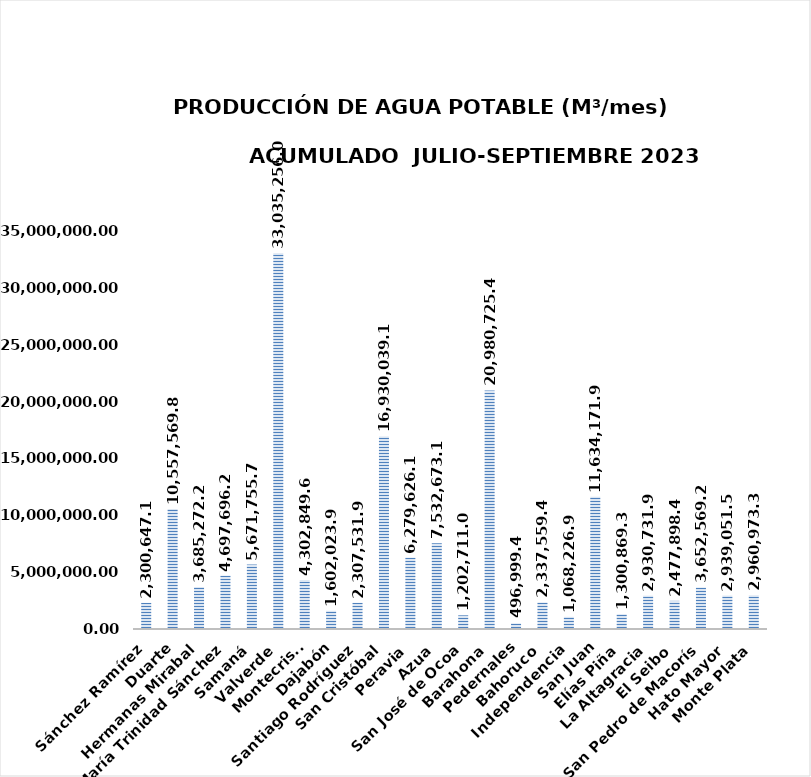
| Category | 2,300,647.12 |
|---|---|
| Sánchez Ramírez | 2300647.12 |
| Duarte | 10557569.82 |
| Hermanas Mirabal | 3685272.2 |
| María Trinidad Sánchez | 4697696.24 |
| Samaná | 5671755.79 |
| Valverde | 33035256 |
| Montecristi | 4302849.6 |
| Dajabón | 1602023.97 |
| Santiago Rodríguez | 2307531.95 |
| San Cristóbal | 16930039.174 |
| Peravia | 6279626.137 |
| Azua | 7532673.18 |
| San José de Ocoa | 1202711.011 |
| Barahona | 20980725.4 |
| Pedernales | 496999.46 |
| Bahoruco | 2337559.42 |
| Independencia | 1068226.926 |
| San Juan | 11634171.94 |
| Elías Piña | 1300869.36 |
| La Altagracia | 2930731.92 |
| El Seibo | 2477898.44 |
| San Pedro de Macorís | 3652569.29 |
| Hato Mayor | 2939051.52 |
| Monte Plata | 2960973.374 |